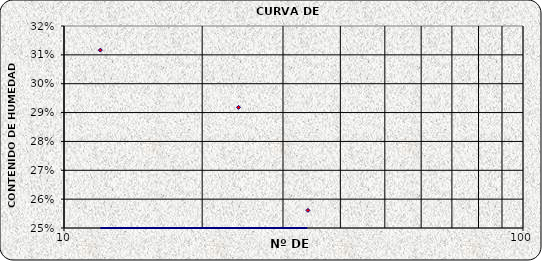
| Category | Series 0 |
|---|---|
| 34.0 | 0.256 |
| 24.0 | 0.292 |
| 12.0 | 0.312 |